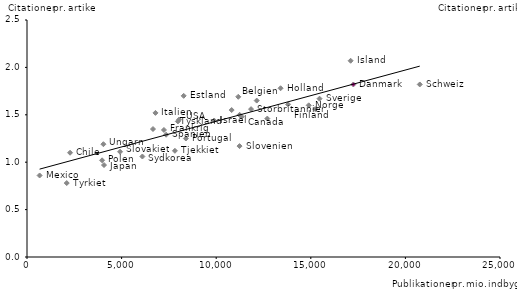
| Category | Citationer pr. artikel |
|---|---|
| 17105.0 | 2.07 |
| 20759.0 | 1.82 |
| 17248.0 | 1.82 |
| 13401.0 | 1.78 |
| 8281.0 | 1.7 |
| 11166.0 | 1.69 |
| 15461.0 | 1.67 |
| 12141.0 | 1.65 |
| 13800.0 | 1.61 |
| 14890.0 | 1.6 |
| 15234.0 | 1.56 |
| 11843.0 | 1.56 |
| 10817.0 | 1.55 |
| 6790.0 | 1.52 |
| 11238.0 | 1.5 |
| 11346.0 | 1.48 |
| 12702.0 | 1.46 |
| 8044.0 | 1.45 |
| 9890.0 | 1.44 |
| 7973.0 | 1.43 |
| 6659.0 | 1.35 |
| 7239.0 | 1.34 |
| 7352.0 | 1.29 |
| 8397.0 | 1.25 |
| 4039.0 | 1.19 |
| 11233.0 | 1.17 |
| 7818.0 | 1.12 |
| 4919.0 | 1.11 |
| 2276.0 | 1.1 |
| 6099.0 | 1.06 |
| 3969.0 | 1.02 |
| 4070.0 | 0.97 |
| 666.0 | 0.86 |
| 2100.0 | 0.78 |